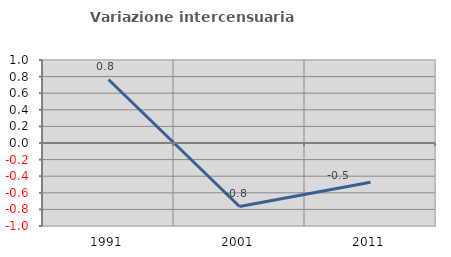
| Category | Variazione intercensuaria annua |
|---|---|
| 1991.0 | 0.765 |
| 2001.0 | -0.764 |
| 2011.0 | -0.472 |